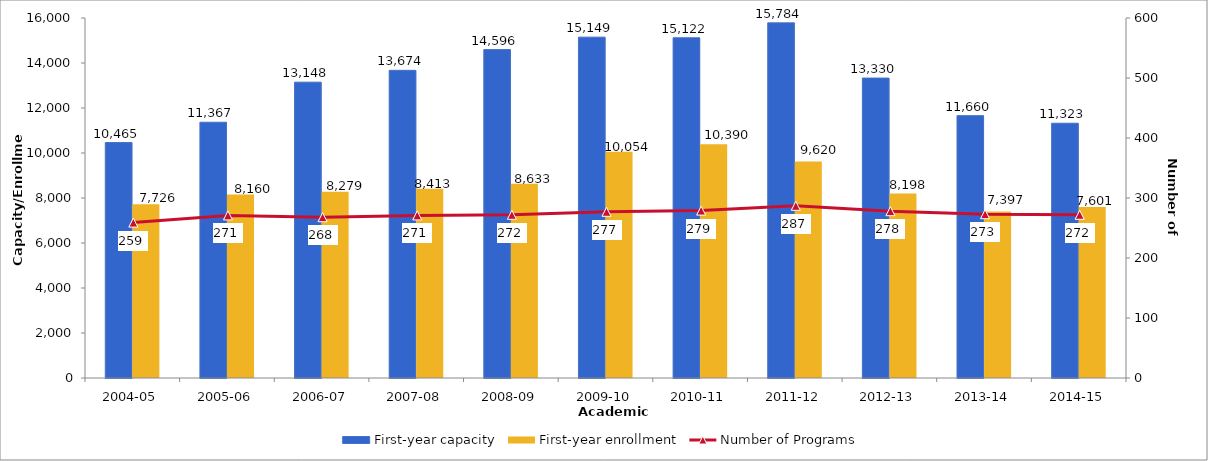
| Category | First-year capacity | First-year enrollment |
|---|---|---|
| 2004-05 | 10465 | 7726 |
| 2005-06 | 11367 | 8160 |
| 2006-07 | 13148 | 8279 |
| 2007-08 | 13674 | 8413 |
| 2008-09 | 14596 | 8633 |
| 2009-10 | 15149 | 10054 |
| 2010-11 | 15122 | 10390 |
| 2011-12 | 15784 | 9620 |
| 2012-13 | 13330 | 8198 |
| 2013-14 | 11660 | 7397 |
| 2014-15 | 11323 | 7601 |